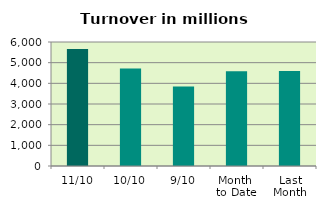
| Category | Series 0 |
|---|---|
| 11/10 | 5661.719 |
| 10/10 | 4713.827 |
| 9/10 | 3842.53 |
| Month 
to Date | 4586.379 |
| Last
Month | 4598.075 |